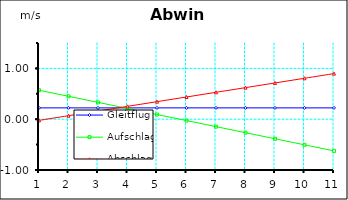
| Category | Gleitflug | Aufschlag | Abschlag |
|---|---|---|---|
| 0 | 0.223 | 0.57 | -0.023 |
| 1 | 0.223 | 0.451 | 0.069 |
| 2 | 0.223 | 0.331 | 0.161 |
| 3 | 0.223 | 0.212 | 0.253 |
| 4 | 0.223 | 0.092 | 0.345 |
| 5 | 0.223 | -0.027 | 0.437 |
| 6 | 0.223 | -0.146 | 0.529 |
| 7 | 0.223 | -0.266 | 0.621 |
| 8 | 0.223 | -0.385 | 0.713 |
| 9 | 0.223 | -0.505 | 0.806 |
| 10 | 0.223 | -0.624 | 0.898 |